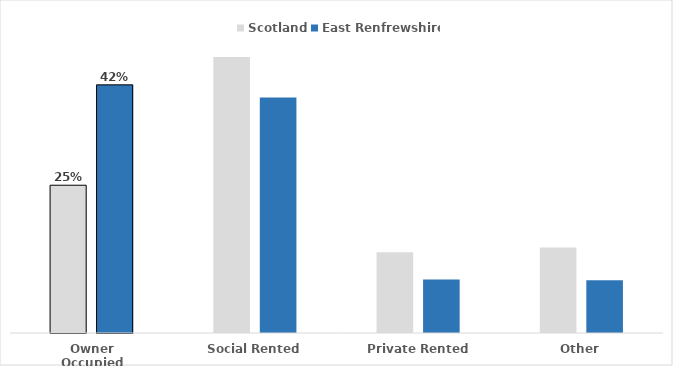
| Category | Scotland | East Renfrewshire |
|---|---|---|
| Owner Occupied | 0.25 | 0.421 |
| Social Rented | 0.468 | 0.399 |
| Private Rented | 0.137 | 0.091 |
| Other | 0.145 | 0.09 |